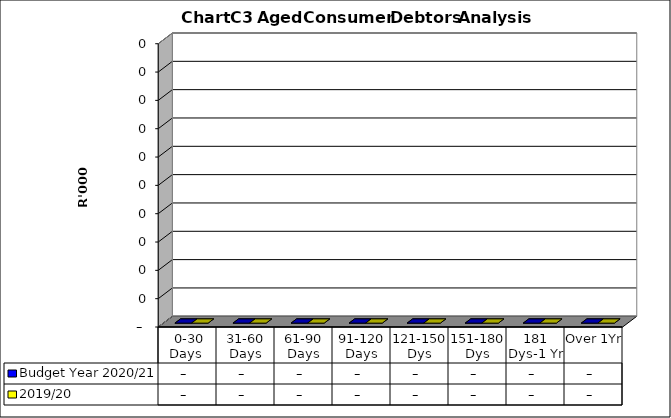
| Category | Budget Year 2020/21 | 2019/20 |
|---|---|---|
|  0-30 Days  | 0 | 0 |
| 31-60 Days | 0 | 0 |
| 61-90 Days | 0 | 0 |
| 91-120 Days | 0 | 0 |
| 121-150 Dys | 0 | 0 |
| 151-180 Dys | 0 | 0 |
| 181 Dys-1 Yr | 0 | 0 |
| Over 1Yr | 0 | 0 |